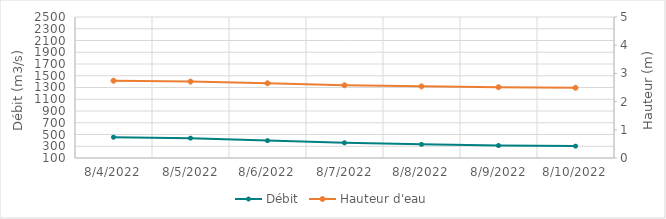
| Category | Débit |
|---|---|
| 4/26/22 | 1140.4 |
| 4/25/22 | 1211.3 |
| 4/24/22 | 1213.26 |
| 4/23/22 | 1202.39 |
| 4/22/22 | 1092.04 |
| 4/21/22 | 872.7 |
| 4/20/22 | 826.65 |